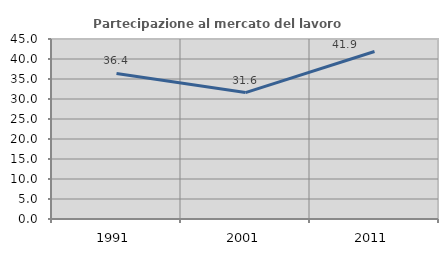
| Category | Partecipazione al mercato del lavoro  femminile |
|---|---|
| 1991.0 | 36.397 |
| 2001.0 | 31.599 |
| 2011.0 | 41.887 |